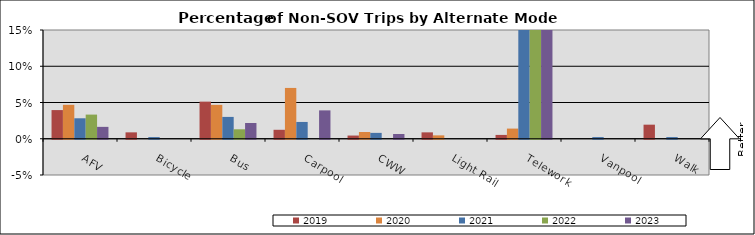
| Category | 2019 | 2020 | 2021 | 2022 | 2023 |
|---|---|---|---|---|---|
| AFV | 0.04 | 0.047 | 0.028 | 0.033 | 0.016 |
| Bicycle | 0.009 | 0 | 0.002 | 0 | 0 |
| Bus | 0.051 | 0.047 | 0.03 | 0.013 | 0.022 |
| Carpool | 0.012 | 0.07 | 0.023 | 0 | 0.039 |
| CWW | 0.004 | 0.009 | 0.008 | 0 | 0.007 |
| Light Rail | 0.009 | 0.005 | 0 | 0 | 0 |
| Telework | 0.005 | 0.014 | 0.477 | 0.504 | 0.591 |
| Vanpool | 0 | 0 | 0.002 | 0 | 0 |
| Walk | 0.019 | 0 | 0.002 | 0 | 0 |